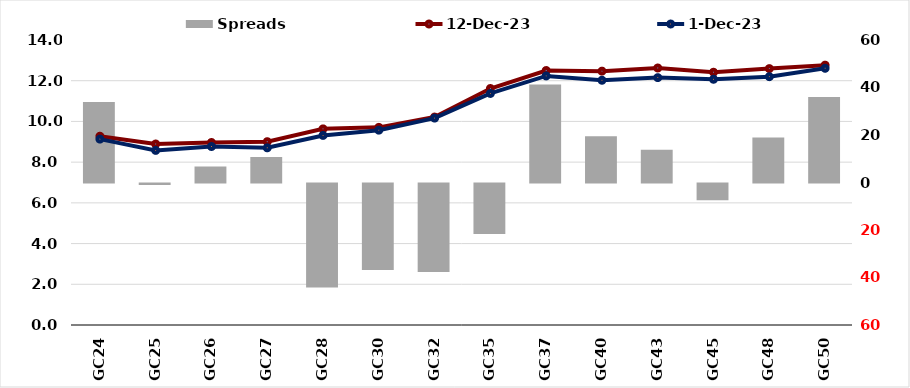
| Category |  Spreads   |
|---|---|
| GC24 | 33.843 |
| GC25 | -0.585 |
| GC26 | 6.748 |
| GC27 | 10.747 |
| GC28 | -43.757 |
| GC30 | -36.421 |
| GC32 | -37.314 |
| GC35 | -21.241 |
| GC37 | 41.294 |
| GC40 | 19.491 |
| GC43 | 13.74 |
| GC45 | -7.061 |
| GC48 | 18.97 |
| GC50 | 35.995 |